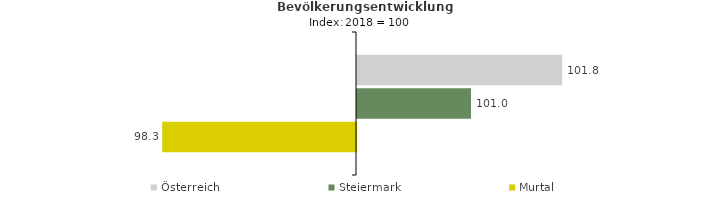
| Category | Österreich | Steiermark | Murtal |
|---|---|---|---|
| 2022.0 | 101.8 | 101 | 98.3 |